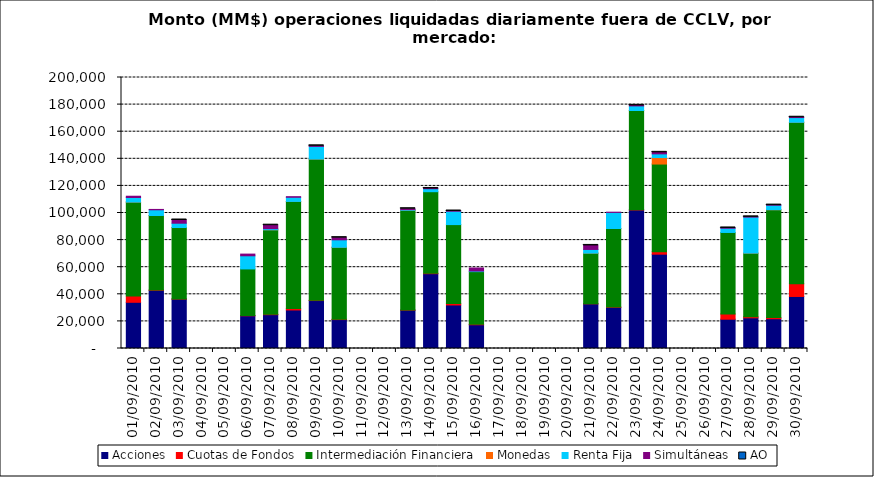
| Category | Acciones | Cuotas de Fondos | Intermediación Financiera | Monedas | Renta Fija | Simultáneas | AO |
|---|---|---|---|---|---|---|---|
| 01/09/2010 | 34100.794 | 4612.539 | 69335.242 | 7.071 | 3388.008 | 932.531 | 0 |
| 02/09/2010 | 42932.97 | 252.621 | 54979.663 | 0.393 | 4200.355 | 271.553 | 0 |
| 03/09/2010 | 36464.457 | 127.405 | 52677.698 | 10.265 | 3183.548 | 2361.972 | 0.219 |
| 06/09/2010 | 24141.495 | 185.606 | 34394.576 | 0 | 9700.626 | 1246.507 | 0 |
| 07/09/2010 | 24971.785 | 242.423 | 62382.583 | 0.395 | 846.129 | 2561.364 | 0.109 |
| 08/09/2010 | 28424.091 | 1132.057 | 78976.158 | 9.274 | 3056.917 | 448.519 | 0 |
| 09/09/2010 | 35394.577 | 169.287 | 104215.607 | 11.83 | 9371.981 | 403.867 | 1.252 |
| 10/09/2010 | 21347.403 | 247.435 | 53095.126 | 3.234 | 5509.933 | 1577.544 | 0.356 |
| 13/09/2010 | 28293.731 | 66.841 | 73622.564 | 3.555 | 521.778 | 630.869 | 9.038 |
| 14/09/2010 | 55213.896 | 267.477 | 60233.374 | 0 | 2218.023 | 171.835 | 0.291 |
| 15/09/2010 | 32125.602 | 1171.878 | 58144.667 | 0 | 9860.937 | 159.64 | 0.087 |
| 16/09/2010 | 17525.251 | 383.382 | 38811.355 | 0 | 455.232 | 2234.068 | 0 |
| 21/09/2010 | 32978.886 | 12.507 | 37381.338 | 0.57 | 2727.435 | 2967.782 | 0.029 |
| 22/09/2010 | 30377.807 | 171.974 | 58010.903 | 9.085 | 11857.049 | 161.163 | 0 |
| 23/09/2010 | 102225.405 | 133.141 | 73279.365 | 7.215 | 3402.729 | 370.479 | 0.176 |
| 24/09/2010 | 69609.58 | 1817.766 | 64695.729 | 4789.082 | 2726.535 | 1121.925 | 0.337 |
| 27/09/2010 | 21622.848 | 3862.327 | 60155.322 | 0 | 3121.058 | 201.879 | 0.219 |
| 28/09/2010 | 22638.161 | 805.817 | 46923.146 | 30.419 | 26580.796 | 169.025 | 0.5 |
| 29/09/2010 | 21958.452 | 911.28 | 79546.513 | 1.95 | 3331.358 | 62.7 | 6.29 |
| 30/09/2010 | 38403.903 | 9365.352 | 119160.068 | 14.945 | 3478.762 | 241.042 | 9.681 |